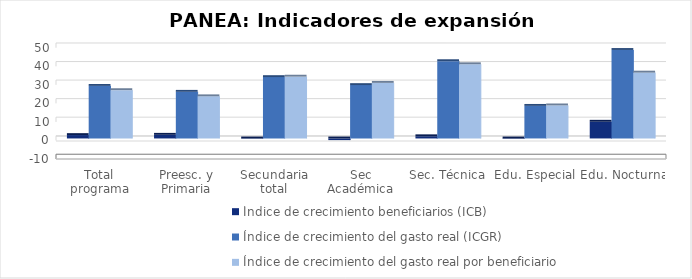
| Category | Índice de crecimiento beneficiarios (ICB)  | Índice de crecimiento del gasto real (ICGR)  | Índice de crecimiento del gasto real por beneficiario (ICGRB)  |
|---|---|---|---|
| Total programa | 1.831 | 28.357 | 26.049 |
| Preesc. y Primaria | 1.973 | 25.159 | 22.737 |
| Secundaria total | -0.181 | 33.093 | 33.334 |
| Sec Académica | -0.924 | 28.786 | 29.987 |
| Sec. Técnica | 1.181 | 41.677 | 40.024 |
| Edu. Especial | -0.219 | 17.573 | 17.831 |
| Edu. Nocturna | 9.006 | 47.725 | 35.52 |